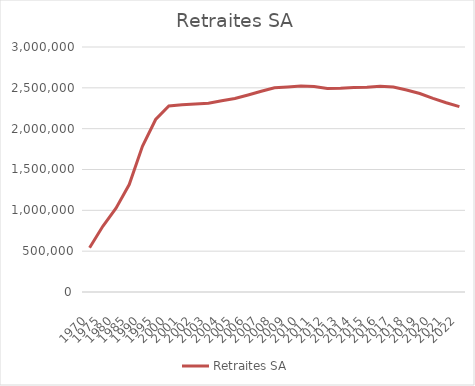
| Category | Retraites SA |
|---|---|
| 1970.0 | 542000 |
| 1975.0 | 805000 |
| 1980.0 | 1025914 |
| 1985.0 | 1315144 |
| 1990.0 | 1784595 |
| 1995.0 | 2112442 |
| 2000.0 | 2278824 |
| 2001.0 | 2292176 |
| 2002.0 | 2302166 |
| 2003.0 | 2311276 |
| 2004.0 | 2341333 |
| 2005.0 | 2369113 |
| 2006.0 | 2412941 |
| 2007.0 | 2457406 |
| 2008.0 | 2501653 |
| 2009.0 | 2509526 |
| 2010.0 | 2520973 |
| 2011.0 | 2514936 |
| 2012.0 | 2492472 |
| 2013.0 | 2495126 |
| 2014.0 | 2503516 |
| 2015.0 | 2507737 |
| 2016.0 | 2519377 |
| 2017.0 | 2509483 |
| 2018.0 | 2472685 |
| 2019.0 | 2430021 |
| 2020.0 | 2370893 |
| 2021.0 | 2317633 |
| 2022.0 | 2269648 |